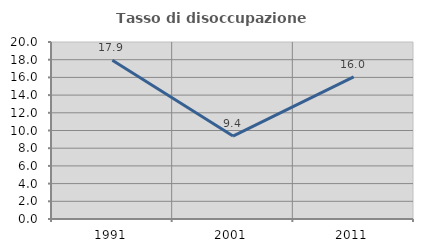
| Category | Tasso di disoccupazione giovanile  |
|---|---|
| 1991.0 | 17.937 |
| 2001.0 | 9.375 |
| 2011.0 | 16.049 |